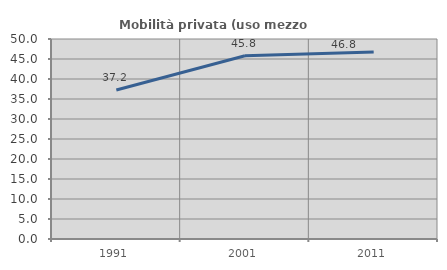
| Category | Mobilità privata (uso mezzo privato) |
|---|---|
| 1991.0 | 37.244 |
| 2001.0 | 45.827 |
| 2011.0 | 46.777 |